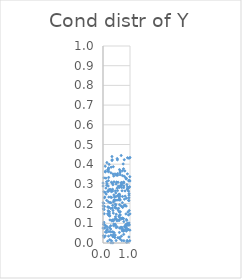
| Category | Series 0 |
|---|---|
| -100.0 | -100 |
| -100.0 | -100 |
| 0.3770401600886948 | 0.055 |
| -100.0 | -100 |
| -100.0 | -100 |
| -100.0 | -100 |
| -100.0 | -100 |
| -100.0 | -100 |
| -100.0 | -100 |
| -100.0 | -100 |
| -100.0 | -100 |
| -100.0 | -100 |
| -100.0 | -100 |
| -100.0 | -100 |
| -100.0 | -100 |
| -100.0 | -100 |
| -100.0 | -100 |
| -100.0 | -100 |
| 0.6913945157025785 | 0.291 |
| -100.0 | -100 |
| -100.0 | -100 |
| -100.0 | -100 |
| -100.0 | -100 |
| -100.0 | -100 |
| -100.0 | -100 |
| -100.0 | -100 |
| -100.0 | -100 |
| -100.0 | -100 |
| -100.0 | -100 |
| 0.33213109948831887 | 0.439 |
| -100.0 | -100 |
| -100.0 | -100 |
| -100.0 | -100 |
| -100.0 | -100 |
| -100.0 | -100 |
| -100.0 | -100 |
| -100.0 | -100 |
| -100.0 | -100 |
| -100.0 | -100 |
| -100.0 | -100 |
| -100.0 | -100 |
| -100.0 | -100 |
| -100.0 | -100 |
| -100.0 | -100 |
| -100.0 | -100 |
| -100.0 | -100 |
| -100.0 | -100 |
| -100.0 | -100 |
| -100.0 | -100 |
| -100.0 | -100 |
| -100.0 | -100 |
| -100.0 | -100 |
| -100.0 | -100 |
| -100.0 | -100 |
| -100.0 | -100 |
| -100.0 | -100 |
| -100.0 | -100 |
| 0.8707011105194766 | 0.092 |
| -100.0 | -100 |
| 0.6123782956940411 | 0.247 |
| -100.0 | -100 |
| -100.0 | -100 |
| -100.0 | -100 |
| 0.7055638715201182 | 0.265 |
| -100.0 | -100 |
| 0.19282466787788288 | 0.164 |
| -100.0 | -100 |
| -100.0 | -100 |
| -100.0 | -100 |
| -100.0 | -100 |
| -100.0 | -100 |
| -100.0 | -100 |
| -100.0 | -100 |
| -100.0 | -100 |
| -100.0 | -100 |
| -100.0 | -100 |
| -100.0 | -100 |
| -100.0 | -100 |
| -100.0 | -100 |
| -100.0 | -100 |
| -100.0 | -100 |
| -100.0 | -100 |
| -100.0 | -100 |
| 0.7735663524071709 | 0.012 |
| -100.0 | -100 |
| -100.0 | -100 |
| -100.0 | -100 |
| -100.0 | -100 |
| -100.0 | -100 |
| 0.7619688938425507 | 0.06 |
| -100.0 | -100 |
| -100.0 | -100 |
| -100.0 | -100 |
| 0.5857647660866955 | 0.136 |
| -100.0 | -100 |
| -100.0 | -100 |
| -100.0 | -100 |
| -100.0 | -100 |
| -100.0 | -100 |
| 0.7190541993906285 | 0.366 |
| -100.0 | -100 |
| -100.0 | -100 |
| -100.0 | -100 |
| -100.0 | -100 |
| -100.0 | -100 |
| -100.0 | -100 |
| -100.0 | -100 |
| -100.0 | -100 |
| -100.0 | -100 |
| -100.0 | -100 |
| -100.0 | -100 |
| -100.0 | -100 |
| 0.25015358290772716 | 0.017 |
| -100.0 | -100 |
| 0.24862008410082637 | 0.137 |
| -100.0 | -100 |
| -100.0 | -100 |
| -100.0 | -100 |
| -100.0 | -100 |
| -100.0 | -100 |
| 0.35625961474772116 | 0.273 |
| 0.24089883907188347 | 0.079 |
| -100.0 | -100 |
| -100.0 | -100 |
| -100.0 | -100 |
| -100.0 | -100 |
| 0.3563894415014067 | 0.264 |
| -100.0 | -100 |
| -100.0 | -100 |
| -100.0 | -100 |
| -100.0 | -100 |
| 0.8096488342345498 | 0.366 |
| -100.0 | -100 |
| -100.0 | -100 |
| -100.0 | -100 |
| -100.0 | -100 |
| -100.0 | -100 |
| 0.7379044353510774 | 0.124 |
| -100.0 | -100 |
| -100.0 | -100 |
| -100.0 | -100 |
| -100.0 | -100 |
| -100.0 | -100 |
| -100.0 | -100 |
| -100.0 | -100 |
| 0.17247290289690154 | 0.009 |
| -100.0 | -100 |
| 0.315393455620698 | 0.231 |
| -100.0 | -100 |
| -100.0 | -100 |
| 0.4853713603107648 | 0.299 |
| -100.0 | -100 |
| -100.0 | -100 |
| 0.286843181365671 | 0.088 |
| -100.0 | -100 |
| -100.0 | -100 |
| -100.0 | -100 |
| -100.0 | -100 |
| -100.0 | -100 |
| -100.0 | -100 |
| -100.0 | -100 |
| 0.99370991064668 | 0.337 |
| -100.0 | -100 |
| -100.0 | -100 |
| -100.0 | -100 |
| -100.0 | -100 |
| -100.0 | -100 |
| -100.0 | -100 |
| -100.0 | -100 |
| -100.0 | -100 |
| -100.0 | -100 |
| -100.0 | -100 |
| -100.0 | -100 |
| -100.0 | -100 |
| -100.0 | -100 |
| 0.3707663434086337 | 0.35 |
| -100.0 | -100 |
| -100.0 | -100 |
| -100.0 | -100 |
| -100.0 | -100 |
| -100.0 | -100 |
| -100.0 | -100 |
| -100.0 | -100 |
| -100.0 | -100 |
| -100.0 | -100 |
| -100.0 | -100 |
| -100.0 | -100 |
| 0.20483892071107856 | 0.376 |
| -100.0 | -100 |
| -100.0 | -100 |
| -100.0 | -100 |
| -100.0 | -100 |
| -100.0 | -100 |
| -100.0 | -100 |
| -100.0 | -100 |
| -100.0 | -100 |
| -100.0 | -100 |
| -100.0 | -100 |
| -100.0 | -100 |
| -100.0 | -100 |
| -100.0 | -100 |
| 0.6411752869463068 | 0.159 |
| -100.0 | -100 |
| -100.0 | -100 |
| -100.0 | -100 |
| 0.0047189266787509565 | 0.204 |
| -100.0 | -100 |
| -100.0 | -100 |
| -100.0 | -100 |
| -100.0 | -100 |
| -100.0 | -100 |
| -100.0 | -100 |
| -100.0 | -100 |
| -100.0 | -100 |
| -100.0 | -100 |
| -100.0 | -100 |
| 0.5598886900185825 | 0.308 |
| -100.0 | -100 |
| -100.0 | -100 |
| -100.0 | -100 |
| -100.0 | -100 |
| -100.0 | -100 |
| -100.0 | -100 |
| -100.0 | -100 |
| 0.26218682187245124 | 0.205 |
| -100.0 | -100 |
| -100.0 | -100 |
| -100.0 | -100 |
| -100.0 | -100 |
| 0.6357231042318005 | 0.02 |
| -100.0 | -100 |
| -100.0 | -100 |
| -100.0 | -100 |
| -100.0 | -100 |
| -100.0 | -100 |
| -100.0 | -100 |
| -100.0 | -100 |
| -100.0 | -100 |
| 0.17058249460375985 | 0.262 |
| -100.0 | -100 |
| 0.721867158614324 | 0.182 |
| -100.0 | -100 |
| -100.0 | -100 |
| -100.0 | -100 |
| 0.9036179115283761 | 0.07 |
| -100.0 | -100 |
| -100.0 | -100 |
| -100.0 | -100 |
| -100.0 | -100 |
| -100.0 | -100 |
| -100.0 | -100 |
| -100.0 | -100 |
| 0.9891860247645243 | 0.012 |
| -100.0 | -100 |
| -100.0 | -100 |
| 0.34929064394747134 | 0.178 |
| -100.0 | -100 |
| -100.0 | -100 |
| -100.0 | -100 |
| -100.0 | -100 |
| -100.0 | -100 |
| 0.9101196203561309 | 0.271 |
| 0.6618343937263028 | 0.293 |
| -100.0 | -100 |
| -100.0 | -100 |
| -100.0 | -100 |
| -100.0 | -100 |
| 0.5925541100929643 | 0.248 |
| -100.0 | -100 |
| -100.0 | -100 |
| 0.37776906504216756 | 0.117 |
| -100.0 | -100 |
| -100.0 | -100 |
| -100.0 | -100 |
| -100.0 | -100 |
| -100.0 | -100 |
| -100.0 | -100 |
| -100.0 | -100 |
| -100.0 | -100 |
| -100.0 | -100 |
| -100.0 | -100 |
| -100.0 | -100 |
| 0.016936103314077466 | 0.037 |
| -100.0 | -100 |
| -100.0 | -100 |
| -100.0 | -100 |
| -100.0 | -100 |
| -100.0 | -100 |
| -100.0 | -100 |
| -100.0 | -100 |
| -100.0 | -100 |
| -100.0 | -100 |
| -100.0 | -100 |
| -100.0 | -100 |
| -100.0 | -100 |
| -100.0 | -100 |
| -100.0 | -100 |
| -100.0 | -100 |
| -100.0 | -100 |
| -100.0 | -100 |
| -100.0 | -100 |
| -100.0 | -100 |
| -100.0 | -100 |
| -100.0 | -100 |
| -100.0 | -100 |
| -100.0 | -100 |
| -100.0 | -100 |
| -100.0 | -100 |
| -100.0 | -100 |
| -100.0 | -100 |
| -100.0 | -100 |
| 0.2127999804069317 | 0.27 |
| -100.0 | -100 |
| -100.0 | -100 |
| -100.0 | -100 |
| -100.0 | -100 |
| -100.0 | -100 |
| -100.0 | -100 |
| -100.0 | -100 |
| -100.0 | -100 |
| -100.0 | -100 |
| -100.0 | -100 |
| -100.0 | -100 |
| -100.0 | -100 |
| -100.0 | -100 |
| -100.0 | -100 |
| -100.0 | -100 |
| -100.0 | -100 |
| 0.23855718428013994 | 0.158 |
| -100.0 | -100 |
| -100.0 | -100 |
| -100.0 | -100 |
| 0.05178797495180687 | 0.23 |
| -100.0 | -100 |
| -100.0 | -100 |
| -100.0 | -100 |
| -100.0 | -100 |
| -100.0 | -100 |
| -100.0 | -100 |
| -100.0 | -100 |
| -100.0 | -100 |
| -100.0 | -100 |
| -100.0 | -100 |
| -100.0 | -100 |
| 0.8206559675460036 | 0.189 |
| 0.6139132337469843 | 0.076 |
| -100.0 | -100 |
| -100.0 | -100 |
| -100.0 | -100 |
| -100.0 | -100 |
| -100.0 | -100 |
| -100.0 | -100 |
| -100.0 | -100 |
| 0.4027023508829586 | 0.244 |
| -100.0 | -100 |
| -100.0 | -100 |
| -100.0 | -100 |
| -100.0 | -100 |
| -100.0 | -100 |
| -100.0 | -100 |
| -100.0 | -100 |
| -100.0 | -100 |
| -100.0 | -100 |
| -100.0 | -100 |
| -100.0 | -100 |
| -100.0 | -100 |
| -100.0 | -100 |
| -100.0 | -100 |
| 0.29177457604554813 | 0.356 |
| -100.0 | -100 |
| -100.0 | -100 |
| -100.0 | -100 |
| -100.0 | -100 |
| -100.0 | -100 |
| 0.9208222156654879 | 0.157 |
| -100.0 | -100 |
| -100.0 | -100 |
| -100.0 | -100 |
| 0.0665322853281024 | 0.077 |
| -100.0 | -100 |
| -100.0 | -100 |
| -100.0 | -100 |
| -100.0 | -100 |
| -100.0 | -100 |
| -100.0 | -100 |
| -100.0 | -100 |
| 0.06780708630164067 | 0.233 |
| -100.0 | -100 |
| -100.0 | -100 |
| -100.0 | -100 |
| -100.0 | -100 |
| -100.0 | -100 |
| -100.0 | -100 |
| -100.0 | -100 |
| -100.0 | -100 |
| -100.0 | -100 |
| -100.0 | -100 |
| -100.0 | -100 |
| -100.0 | -100 |
| -100.0 | -100 |
| -100.0 | -100 |
| -100.0 | -100 |
| 0.8826537246963788 | 0.115 |
| -100.0 | -100 |
| -100.0 | -100 |
| -100.0 | -100 |
| -100.0 | -100 |
| -100.0 | -100 |
| 0.7351152672140836 | 0.069 |
| -100.0 | -100 |
| -100.0 | -100 |
| -100.0 | -100 |
| -100.0 | -100 |
| -100.0 | -100 |
| -100.0 | -100 |
| -100.0 | -100 |
| -100.0 | -100 |
| -100.0 | -100 |
| -100.0 | -100 |
| -100.0 | -100 |
| -100.0 | -100 |
| -100.0 | -100 |
| -100.0 | -100 |
| -100.0 | -100 |
| -100.0 | -100 |
| -100.0 | -100 |
| -100.0 | -100 |
| -100.0 | -100 |
| -100.0 | -100 |
| -100.0 | -100 |
| -100.0 | -100 |
| -100.0 | -100 |
| -100.0 | -100 |
| -100.0 | -100 |
| -100.0 | -100 |
| -100.0 | -100 |
| -100.0 | -100 |
| -100.0 | -100 |
| -100.0 | -100 |
| -100.0 | -100 |
| 0.42411828775346494 | 0.234 |
| -100.0 | -100 |
| -100.0 | -100 |
| -100.0 | -100 |
| -100.0 | -100 |
| -100.0 | -100 |
| 0.48604171091406234 | 0.013 |
| -100.0 | -100 |
| -100.0 | -100 |
| -100.0 | -100 |
| -100.0 | -100 |
| -100.0 | -100 |
| -100.0 | -100 |
| -100.0 | -100 |
| -100.0 | -100 |
| 0.3473043457619077 | 0.117 |
| -100.0 | -100 |
| -100.0 | -100 |
| -100.0 | -100 |
| 0.20387021220571977 | 0.262 |
| -100.0 | -100 |
| -100.0 | -100 |
| -100.0 | -100 |
| -100.0 | -100 |
| -100.0 | -100 |
| -100.0 | -100 |
| -100.0 | -100 |
| 0.17213446560471746 | 0.148 |
| -100.0 | -100 |
| 0.1445523625841938 | 0.408 |
| -100.0 | -100 |
| -100.0 | -100 |
| -100.0 | -100 |
| -100.0 | -100 |
| -100.0 | -100 |
| -100.0 | -100 |
| -100.0 | -100 |
| -100.0 | -100 |
| -100.0 | -100 |
| -100.0 | -100 |
| -100.0 | -100 |
| -100.0 | -100 |
| 0.28478546794542814 | 0.057 |
| -100.0 | -100 |
| -100.0 | -100 |
| -100.0 | -100 |
| -100.0 | -100 |
| 0.5493685764881231 | 0.027 |
| -100.0 | -100 |
| -100.0 | -100 |
| -100.0 | -100 |
| 0.9590602246147503 | 0.031 |
| -100.0 | -100 |
| -100.0 | -100 |
| 0.8335299418979698 | 0.081 |
| -100.0 | -100 |
| -100.0 | -100 |
| -100.0 | -100 |
| -100.0 | -100 |
| -100.0 | -100 |
| -100.0 | -100 |
| -100.0 | -100 |
| -100.0 | -100 |
| -100.0 | -100 |
| 0.6362313894038706 | 0.365 |
| -100.0 | -100 |
| -100.0 | -100 |
| -100.0 | -100 |
| -100.0 | -100 |
| -100.0 | -100 |
| -100.0 | -100 |
| -100.0 | -100 |
| -100.0 | -100 |
| -100.0 | -100 |
| -100.0 | -100 |
| -100.0 | -100 |
| -100.0 | -100 |
| -100.0 | -100 |
| 0.5780401185811183 | 0.176 |
| -100.0 | -100 |
| -100.0 | -100 |
| -100.0 | -100 |
| 0.3830650336019338 | 0.041 |
| -100.0 | -100 |
| -100.0 | -100 |
| -100.0 | -100 |
| -100.0 | -100 |
| -100.0 | -100 |
| -100.0 | -100 |
| -100.0 | -100 |
| -100.0 | -100 |
| -100.0 | -100 |
| -100.0 | -100 |
| 0.48475160308143517 | 0.176 |
| -100.0 | -100 |
| -100.0 | -100 |
| 0.3242281908438168 | 0.112 |
| -100.0 | -100 |
| -100.0 | -100 |
| -100.0 | -100 |
| -100.0 | -100 |
| -100.0 | -100 |
| -100.0 | -100 |
| -100.0 | -100 |
| -100.0 | -100 |
| -100.0 | -100 |
| -100.0 | -100 |
| 0.5838517933186005 | 0.22 |
| -100.0 | -100 |
| -100.0 | -100 |
| -100.0 | -100 |
| -100.0 | -100 |
| -100.0 | -100 |
| -100.0 | -100 |
| -100.0 | -100 |
| -100.0 | -100 |
| -100.0 | -100 |
| -100.0 | -100 |
| 0.9042350745434901 | 0.351 |
| -100.0 | -100 |
| -100.0 | -100 |
| -100.0 | -100 |
| -100.0 | -100 |
| -100.0 | -100 |
| -100.0 | -100 |
| -100.0 | -100 |
| -100.0 | -100 |
| -100.0 | -100 |
| -100.0 | -100 |
| -100.0 | -100 |
| -100.0 | -100 |
| -100.0 | -100 |
| -100.0 | -100 |
| 0.1999533531535448 | 0.316 |
| -100.0 | -100 |
| 0.6686756165890543 | 0.124 |
| -100.0 | -100 |
| -100.0 | -100 |
| -100.0 | -100 |
| -100.0 | -100 |
| -100.0 | -100 |
| -100.0 | -100 |
| -100.0 | -100 |
| -100.0 | -100 |
| -100.0 | -100 |
| -100.0 | -100 |
| 0.19835692425443519 | 0.366 |
| 0.1631372747308767 | 0.07 |
| -100.0 | -100 |
| -100.0 | -100 |
| -100.0 | -100 |
| -100.0 | -100 |
| -100.0 | -100 |
| -100.0 | -100 |
| -100.0 | -100 |
| -100.0 | -100 |
| -100.0 | -100 |
| -100.0 | -100 |
| -100.0 | -100 |
| -100.0 | -100 |
| -100.0 | -100 |
| -100.0 | -100 |
| -100.0 | -100 |
| -100.0 | -100 |
| -100.0 | -100 |
| -100.0 | -100 |
| -100.0 | -100 |
| -100.0 | -100 |
| -100.0 | -100 |
| -100.0 | -100 |
| -100.0 | -100 |
| -100.0 | -100 |
| -100.0 | -100 |
| -100.0 | -100 |
| -100.0 | -100 |
| -100.0 | -100 |
| -100.0 | -100 |
| -100.0 | -100 |
| -100.0 | -100 |
| -100.0 | -100 |
| -100.0 | -100 |
| -100.0 | -100 |
| -100.0 | -100 |
| 0.8956222989444316 | 0.013 |
| -100.0 | -100 |
| 0.20584356953565142 | 0.381 |
| -100.0 | -100 |
| -100.0 | -100 |
| -100.0 | -100 |
| -100.0 | -100 |
| -100.0 | -100 |
| -100.0 | -100 |
| -100.0 | -100 |
| 0.577068559446596 | 0.236 |
| -100.0 | -100 |
| -100.0 | -100 |
| -100.0 | -100 |
| -100.0 | -100 |
| -100.0 | -100 |
| -100.0 | -100 |
| 0.388822918600785 | 0.208 |
| -100.0 | -100 |
| -100.0 | -100 |
| -100.0 | -100 |
| -100.0 | -100 |
| -100.0 | -100 |
| 0.07777021280039365 | 0.257 |
| -100.0 | -100 |
| -100.0 | -100 |
| -100.0 | -100 |
| -100.0 | -100 |
| -100.0 | -100 |
| 0.5919151004512939 | 0.284 |
| -100.0 | -100 |
| -100.0 | -100 |
| -100.0 | -100 |
| 0.17696826387912135 | 0.372 |
| -100.0 | -100 |
| 0.9850324376653254 | 0.285 |
| -100.0 | -100 |
| -100.0 | -100 |
| -100.0 | -100 |
| -100.0 | -100 |
| -100.0 | -100 |
| -100.0 | -100 |
| -100.0 | -100 |
| -100.0 | -100 |
| -100.0 | -100 |
| -100.0 | -100 |
| -100.0 | -100 |
| -100.0 | -100 |
| -100.0 | -100 |
| -100.0 | -100 |
| -100.0 | -100 |
| -100.0 | -100 |
| -100.0 | -100 |
| -100.0 | -100 |
| -100.0 | -100 |
| 0.5420806201659478 | 0.344 |
| -100.0 | -100 |
| -100.0 | -100 |
| 0.6921422658287867 | 0.123 |
| -100.0 | -100 |
| -100.0 | -100 |
| -100.0 | -100 |
| 0.552553589100597 | 0.174 |
| -100.0 | -100 |
| -100.0 | -100 |
| -100.0 | -100 |
| -100.0 | -100 |
| 0.8488629937304234 | 0.147 |
| -100.0 | -100 |
| -100.0 | -100 |
| 0.9077538267467223 | 0.433 |
| -100.0 | -100 |
| -100.0 | -100 |
| -100.0 | -100 |
| -100.0 | -100 |
| -100.0 | -100 |
| -100.0 | -100 |
| 0.6340829413864436 | 0.347 |
| -100.0 | -100 |
| -100.0 | -100 |
| -100.0 | -100 |
| -100.0 | -100 |
| -100.0 | -100 |
| -100.0 | -100 |
| -100.0 | -100 |
| -100.0 | -100 |
| -100.0 | -100 |
| -100.0 | -100 |
| -100.0 | -100 |
| -100.0 | -100 |
| -100.0 | -100 |
| -100.0 | -100 |
| -100.0 | -100 |
| -100.0 | -100 |
| -100.0 | -100 |
| -100.0 | -100 |
| 0.45881403158455014 | 0.264 |
| -100.0 | -100 |
| -100.0 | -100 |
| 0.9756271854557683 | 0.092 |
| -100.0 | -100 |
| -100.0 | -100 |
| -100.0 | -100 |
| -100.0 | -100 |
| -100.0 | -100 |
| -100.0 | -100 |
| 0.31359900893341974 | 0.012 |
| -100.0 | -100 |
| -100.0 | -100 |
| 0.768006095408884 | 0.31 |
| 0.8677883006619158 | 0.328 |
| 0.6152467249742798 | 0.194 |
| -100.0 | -100 |
| -100.0 | -100 |
| -100.0 | -100 |
| -100.0 | -100 |
| -100.0 | -100 |
| -100.0 | -100 |
| 0.8959984174927841 | 0.274 |
| -100.0 | -100 |
| -100.0 | -100 |
| -100.0 | -100 |
| -100.0 | -100 |
| -100.0 | -100 |
| -100.0 | -100 |
| -100.0 | -100 |
| -100.0 | -100 |
| 0.8392663974706244 | 0.331 |
| -100.0 | -100 |
| -100.0 | -100 |
| -100.0 | -100 |
| -100.0 | -100 |
| -100.0 | -100 |
| -100.0 | -100 |
| -100.0 | -100 |
| -100.0 | -100 |
| -100.0 | -100 |
| -100.0 | -100 |
| -100.0 | -100 |
| -100.0 | -100 |
| -100.0 | -100 |
| -100.0 | -100 |
| 0.45524642133074955 | 0.123 |
| -100.0 | -100 |
| -100.0 | -100 |
| -100.0 | -100 |
| 0.6010487845452768 | 0.116 |
| 0.8599806182494371 | 0.187 |
| -100.0 | -100 |
| -100.0 | -100 |
| -100.0 | -100 |
| -100.0 | -100 |
| -100.0 | -100 |
| -100.0 | -100 |
| -100.0 | -100 |
| -100.0 | -100 |
| -100.0 | -100 |
| -100.0 | -100 |
| 0.3755476556356424 | 0.112 |
| -100.0 | -100 |
| -100.0 | -100 |
| -100.0 | -100 |
| -100.0 | -100 |
| -100.0 | -100 |
| -100.0 | -100 |
| -100.0 | -100 |
| 0.00455978771621135 | 0.188 |
| -100.0 | -100 |
| -100.0 | -100 |
| -100.0 | -100 |
| -100.0 | -100 |
| -100.0 | -100 |
| -100.0 | -100 |
| -100.0 | -100 |
| -100.0 | -100 |
| -100.0 | -100 |
| -100.0 | -100 |
| -100.0 | -100 |
| -100.0 | -100 |
| 0.03151058658474193 | 0.26 |
| -100.0 | -100 |
| -100.0 | -100 |
| -100.0 | -100 |
| -100.0 | -100 |
| -100.0 | -100 |
| -100.0 | -100 |
| -100.0 | -100 |
| -100.0 | -100 |
| -100.0 | -100 |
| -100.0 | -100 |
| -100.0 | -100 |
| -100.0 | -100 |
| -100.0 | -100 |
| -100.0 | -100 |
| -100.0 | -100 |
| -100.0 | -100 |
| -100.0 | -100 |
| -100.0 | -100 |
| -100.0 | -100 |
| -100.0 | -100 |
| -100.0 | -100 |
| -100.0 | -100 |
| -100.0 | -100 |
| -100.0 | -100 |
| -100.0 | -100 |
| -100.0 | -100 |
| -100.0 | -100 |
| -100.0 | -100 |
| -100.0 | -100 |
| -100.0 | -100 |
| -100.0 | -100 |
| -100.0 | -100 |
| -100.0 | -100 |
| -100.0 | -100 |
| -100.0 | -100 |
| -100.0 | -100 |
| -100.0 | -100 |
| -100.0 | -100 |
| -100.0 | -100 |
| -100.0 | -100 |
| -100.0 | -100 |
| -100.0 | -100 |
| -100.0 | -100 |
| -100.0 | -100 |
| -100.0 | -100 |
| -100.0 | -100 |
| -100.0 | -100 |
| -100.0 | -100 |
| 0.6927581288692315 | 0.299 |
| -100.0 | -100 |
| -100.0 | -100 |
| -100.0 | -100 |
| -100.0 | -100 |
| -100.0 | -100 |
| -100.0 | -100 |
| -100.0 | -100 |
| -100.0 | -100 |
| -100.0 | -100 |
| -100.0 | -100 |
| -100.0 | -100 |
| 0.09142290454788005 | 0.089 |
| 0.9645503005092667 | 0.25 |
| 0.7858349572824984 | 0.191 |
| 0.22086267923440472 | 0.18 |
| -100.0 | -100 |
| -100.0 | -100 |
| -100.0 | -100 |
| -100.0 | -100 |
| -100.0 | -100 |
| 0.51459410416059 | 0.118 |
| -100.0 | -100 |
| -100.0 | -100 |
| -100.0 | -100 |
| -100.0 | -100 |
| 0.197177732035701 | 0.183 |
| -100.0 | -100 |
| -100.0 | -100 |
| -100.0 | -100 |
| -100.0 | -100 |
| -100.0 | -100 |
| -100.0 | -100 |
| 0.2968764456622638 | 0.001 |
| -100.0 | -100 |
| -100.0 | -100 |
| -100.0 | -100 |
| -100.0 | -100 |
| -100.0 | -100 |
| -100.0 | -100 |
| -100.0 | -100 |
| -100.0 | -100 |
| -100.0 | -100 |
| -100.0 | -100 |
| -100.0 | -100 |
| -100.0 | -100 |
| 0.43064883158171463 | 0.029 |
| -100.0 | -100 |
| -100.0 | -100 |
| -100.0 | -100 |
| -100.0 | -100 |
| -100.0 | -100 |
| 0.17404739352441734 | 0.183 |
| -100.0 | -100 |
| -100.0 | -100 |
| -100.0 | -100 |
| -100.0 | -100 |
| -100.0 | -100 |
| -100.0 | -100 |
| -100.0 | -100 |
| -100.0 | -100 |
| -100.0 | -100 |
| -100.0 | -100 |
| 0.96256508138763 | 0.102 |
| -100.0 | -100 |
| -100.0 | -100 |
| -100.0 | -100 |
| -100.0 | -100 |
| -100.0 | -100 |
| -100.0 | -100 |
| -100.0 | -100 |
| -100.0 | -100 |
| -100.0 | -100 |
| -100.0 | -100 |
| -100.0 | -100 |
| -100.0 | -100 |
| -100.0 | -100 |
| -100.0 | -100 |
| -100.0 | -100 |
| -100.0 | -100 |
| -100.0 | -100 |
| -100.0 | -100 |
| -100.0 | -100 |
| -100.0 | -100 |
| -100.0 | -100 |
| 0.339841974460237 | 0.422 |
| -100.0 | -100 |
| -100.0 | -100 |
| -100.0 | -100 |
| -100.0 | -100 |
| -100.0 | -100 |
| -100.0 | -100 |
| -100.0 | -100 |
| -100.0 | -100 |
| -100.0 | -100 |
| -100.0 | -100 |
| -100.0 | -100 |
| -100.0 | -100 |
| -100.0 | -100 |
| -100.0 | -100 |
| -100.0 | -100 |
| -100.0 | -100 |
| -100.0 | -100 |
| -100.0 | -100 |
| -100.0 | -100 |
| -100.0 | -100 |
| -100.0 | -100 |
| -100.0 | -100 |
| -100.0 | -100 |
| -100.0 | -100 |
| -100.0 | -100 |
| -100.0 | -100 |
| 0.0004465700328029065 | 0.304 |
| -100.0 | -100 |
| -100.0 | -100 |
| -100.0 | -100 |
| -100.0 | -100 |
| -100.0 | -100 |
| -100.0 | -100 |
| -100.0 | -100 |
| -100.0 | -100 |
| -100.0 | -100 |
| -100.0 | -100 |
| -100.0 | -100 |
| -100.0 | -100 |
| -100.0 | -100 |
| -100.0 | -100 |
| -100.0 | -100 |
| -100.0 | -100 |
| -100.0 | -100 |
| -100.0 | -100 |
| -100.0 | -100 |
| -100.0 | -100 |
| -100.0 | -100 |
| -100.0 | -100 |
| -100.0 | -100 |
| -100.0 | -100 |
| -100.0 | -100 |
| -100.0 | -100 |
| 0.20979730202030633 | 0.333 |
| -100.0 | -100 |
| -100.0 | -100 |
| -100.0 | -100 |
| -100.0 | -100 |
| -100.0 | -100 |
| 0.4896147592398563 | 0.344 |
| -100.0 | -100 |
| -100.0 | -100 |
| -100.0 | -100 |
| -100.0 | -100 |
| -100.0 | -100 |
| -100.0 | -100 |
| -100.0 | -100 |
| -100.0 | -100 |
| -100.0 | -100 |
| -100.0 | -100 |
| 0.5681066527665231 | 0.165 |
| -100.0 | -100 |
| -100.0 | -100 |
| -100.0 | -100 |
| -100.0 | -100 |
| -100.0 | -100 |
| -100.0 | -100 |
| -100.0 | -100 |
| -100.0 | -100 |
| -100.0 | -100 |
| -100.0 | -100 |
| -100.0 | -100 |
| 0.44268885373194455 | 0.184 |
| 0.01984809089938322 | 0.095 |
| 0.45357586060157207 | 0.04 |
| -100.0 | -100 |
| -100.0 | -100 |
| -100.0 | -100 |
| -100.0 | -100 |
| -100.0 | -100 |
| -100.0 | -100 |
| -100.0 | -100 |
| -100.0 | -100 |
| 0.5127503489402726 | 0.308 |
| -100.0 | -100 |
| -100.0 | -100 |
| -100.0 | -100 |
| -100.0 | -100 |
| -100.0 | -100 |
| -100.0 | -100 |
| -100.0 | -100 |
| 0.7735496449176846 | 0.29 |
| -100.0 | -100 |
| -100.0 | -100 |
| -100.0 | -100 |
| -100.0 | -100 |
| -100.0 | -100 |
| -100.0 | -100 |
| -100.0 | -100 |
| -100.0 | -100 |
| -100.0 | -100 |
| -100.0 | -100 |
| -100.0 | -100 |
| -100.0 | -100 |
| -100.0 | -100 |
| 0.6121772327041202 | 0.14 |
| -100.0 | -100 |
| 0.43654888059258323 | 0.028 |
| -100.0 | -100 |
| -100.0 | -100 |
| -100.0 | -100 |
| -100.0 | -100 |
| -100.0 | -100 |
| -100.0 | -100 |
| -100.0 | -100 |
| -100.0 | -100 |
| -100.0 | -100 |
| -100.0 | -100 |
| 0.4806000786111889 | 0.194 |
| -100.0 | -100 |
| -100.0 | -100 |
| -100.0 | -100 |
| -100.0 | -100 |
| -100.0 | -100 |
| -100.0 | -100 |
| -100.0 | -100 |
| -100.0 | -100 |
| -100.0 | -100 |
| -100.0 | -100 |
| -100.0 | -100 |
| -100.0 | -100 |
| -100.0 | -100 |
| -100.0 | -100 |
| -100.0 | -100 |
| 0.9727994890727825 | 0.318 |
| -100.0 | -100 |
| -100.0 | -100 |
| -100.0 | -100 |
| -100.0 | -100 |
| -100.0 | -100 |
| 0.9157075769121742 | 0.005 |
| -100.0 | -100 |
| -100.0 | -100 |
| -100.0 | -100 |
| -100.0 | -100 |
| -100.0 | -100 |
| -100.0 | -100 |
| -100.0 | -100 |
| -100.0 | -100 |
| -100.0 | -100 |
| -100.0 | -100 |
| -100.0 | -100 |
| 0.3934247255628939 | 0.088 |
| -100.0 | -100 |
| -100.0 | -100 |
| -100.0 | -100 |
| -100.0 | -100 |
| -100.0 | -100 |
| -100.0 | -100 |
| -100.0 | -100 |
| -100.0 | -100 |
| -100.0 | -100 |
| -100.0 | -100 |
| -100.0 | -100 |
| -100.0 | -100 |
| -100.0 | -100 |
| -100.0 | -100 |
| -100.0 | -100 |
| -100.0 | -100 |
| 0.4586998835743056 | 0.197 |
| -100.0 | -100 |
| -100.0 | -100 |
| 0.033208634921095936 | 0.331 |
| -100.0 | -100 |
| -100.0 | -100 |
| -100.0 | -100 |
| -100.0 | -100 |
| -100.0 | -100 |
| -100.0 | -100 |
| -100.0 | -100 |
| -100.0 | -100 |
| 0.11860535695333208 | 0.248 |
| -100.0 | -100 |
| 0.6035178476581329 | 0.282 |
| -100.0 | -100 |
| -100.0 | -100 |
| -100.0 | -100 |
| -100.0 | -100 |
| -100.0 | -100 |
| -100.0 | -100 |
| 0.6071110858480017 | 0.054 |
| -100.0 | -100 |
| -100.0 | -100 |
| -100.0 | -100 |
| -100.0 | -100 |
| 0.1325320798479631 | 0.311 |
| -100.0 | -100 |
| -100.0 | -100 |
| -100.0 | -100 |
| -100.0 | -100 |
| -100.0 | -100 |
| -100.0 | -100 |
| -100.0 | -100 |
| -100.0 | -100 |
| -100.0 | -100 |
| -100.0 | -100 |
| -100.0 | -100 |
| 0.22269695885558993 | 0.058 |
| -100.0 | -100 |
| -100.0 | -100 |
| -100.0 | -100 |
| -100.0 | -100 |
| -100.0 | -100 |
| -100.0 | -100 |
| -100.0 | -100 |
| -100.0 | -100 |
| -100.0 | -100 |
| -100.0 | -100 |
| -100.0 | -100 |
| 0.44476595598663804 | 0.351 |
| -100.0 | -100 |
| -100.0 | -100 |
| -100.0 | -100 |
| -100.0 | -100 |
| -100.0 | -100 |
| -100.0 | -100 |
| -100.0 | -100 |
| -100.0 | -100 |
| -100.0 | -100 |
| 0.3110775362938648 | 0.261 |
| -100.0 | -100 |
| -100.0 | -100 |
| -100.0 | -100 |
| -100.0 | -100 |
| -100.0 | -100 |
| 0.29647942918023373 | 0.04 |
| -100.0 | -100 |
| -100.0 | -100 |
| -100.0 | -100 |
| -100.0 | -100 |
| -100.0 | -100 |
| -100.0 | -100 |
| -100.0 | -100 |
| -100.0 | -100 |
| -100.0 | -100 |
| -100.0 | -100 |
| -100.0 | -100 |
| -100.0 | -100 |
| -100.0 | -100 |
| -100.0 | -100 |
| -100.0 | -100 |
| -100.0 | -100 |
| 0.04121439483243228 | 0.029 |
| -100.0 | -100 |
| 0.8011951817732197 | 0.082 |
| -100.0 | -100 |
| -100.0 | -100 |
| -100.0 | -100 |
| -100.0 | -100 |
| -100.0 | -100 |
| -100.0 | -100 |
| -100.0 | -100 |
| -100.0 | -100 |
| -100.0 | -100 |
| -100.0 | -100 |
| -100.0 | -100 |
| -100.0 | -100 |
| -100.0 | -100 |
| -100.0 | -100 |
| -100.0 | -100 |
| -100.0 | -100 |
| -100.0 | -100 |
| -100.0 | -100 |
| -100.0 | -100 |
| -100.0 | -100 |
| -100.0 | -100 |
| -100.0 | -100 |
| -100.0 | -100 |
| -100.0 | -100 |
| 0.46551630905785313 | 0.217 |
| -100.0 | -100 |
| -100.0 | -100 |
| -100.0 | -100 |
| -100.0 | -100 |
| -100.0 | -100 |
| -100.0 | -100 |
| -100.0 | -100 |
| 0.5392615772719487 | 0.24 |
| -100.0 | -100 |
| -100.0 | -100 |
| -100.0 | -100 |
| -100.0 | -100 |
| -100.0 | -100 |
| -100.0 | -100 |
| -100.0 | -100 |
| -100.0 | -100 |
| -100.0 | -100 |
| -100.0 | -100 |
| -100.0 | -100 |
| -100.0 | -100 |
| 0.0445028603438391 | 0.148 |
| -100.0 | -100 |
| -100.0 | -100 |
| -100.0 | -100 |
| -100.0 | -100 |
| -100.0 | -100 |
| -100.0 | -100 |
| -100.0 | -100 |
| -100.0 | -100 |
| -100.0 | -100 |
| -100.0 | -100 |
| -100.0 | -100 |
| 0.607609178526056 | 0.228 |
| 0.3582830783888259 | 0.191 |
| -100.0 | -100 |
| -100.0 | -100 |
| -100.0 | -100 |
| -100.0 | -100 |
| -100.0 | -100 |
| -100.0 | -100 |
| 0.998213293910305 | 0.148 |
| 0.3336587039977059 | 0.419 |
| -100.0 | -100 |
| -100.0 | -100 |
| -100.0 | -100 |
| -100.0 | -100 |
| -100.0 | -100 |
| -100.0 | -100 |
| -100.0 | -100 |
| -100.0 | -100 |
| -100.0 | -100 |
| -100.0 | -100 |
| -100.0 | -100 |
| -100.0 | -100 |
| -100.0 | -100 |
| -100.0 | -100 |
| -100.0 | -100 |
| -100.0 | -100 |
| 0.2577411959455074 | 0.117 |
| -100.0 | -100 |
| -100.0 | -100 |
| -100.0 | -100 |
| -100.0 | -100 |
| -100.0 | -100 |
| -100.0 | -100 |
| -100.0 | -100 |
| -100.0 | -100 |
| -100.0 | -100 |
| -100.0 | -100 |
| -100.0 | -100 |
| -100.0 | -100 |
| -100.0 | -100 |
| -100.0 | -100 |
| -100.0 | -100 |
| -100.0 | -100 |
| -100.0 | -100 |
| -100.0 | -100 |
| -100.0 | -100 |
| -100.0 | -100 |
| -100.0 | -100 |
| -100.0 | -100 |
| -100.0 | -100 |
| -100.0 | -100 |
| 0.3128516006483426 | 0.308 |
| -100.0 | -100 |
| -100.0 | -100 |
| -100.0 | -100 |
| -100.0 | -100 |
| -100.0 | -100 |
| -100.0 | -100 |
| -100.0 | -100 |
| -100.0 | -100 |
| -100.0 | -100 |
| -100.0 | -100 |
| -100.0 | -100 |
| -100.0 | -100 |
| -100.0 | -100 |
| 0.5066923761383526 | 0.309 |
| 0.526828761234891 | 0.082 |
| -100.0 | -100 |
| -100.0 | -100 |
| -100.0 | -100 |
| -100.0 | -100 |
| -100.0 | -100 |
| -100.0 | -100 |
| -100.0 | -100 |
| -100.0 | -100 |
| -100.0 | -100 |
| -100.0 | -100 |
| -100.0 | -100 |
| -100.0 | -100 |
| -100.0 | -100 |
| -100.0 | -100 |
| -100.0 | -100 |
| -100.0 | -100 |
| -100.0 | -100 |
| -100.0 | -100 |
| -100.0 | -100 |
| -100.0 | -100 |
| -100.0 | -100 |
| -100.0 | -100 |
| -100.0 | -100 |
| -100.0 | -100 |
| -100.0 | -100 |
| -100.0 | -100 |
| -100.0 | -100 |
| -100.0 | -100 |
| -100.0 | -100 |
| -100.0 | -100 |
| 0.08488567385324741 | 0.361 |
| -100.0 | -100 |
| -100.0 | -100 |
| -100.0 | -100 |
| -100.0 | -100 |
| -100.0 | -100 |
| -100.0 | -100 |
| 0.767078818994839 | 0.044 |
| -100.0 | -100 |
| -100.0 | -100 |
| -100.0 | -100 |
| -100.0 | -100 |
| -100.0 | -100 |
| -100.0 | -100 |
| -100.0 | -100 |
| -100.0 | -100 |
| -100.0 | -100 |
| -100.0 | -100 |
| -100.0 | -100 |
| -100.0 | -100 |
| -100.0 | -100 |
| -100.0 | -100 |
| -100.0 | -100 |
| -100.0 | -100 |
| -100.0 | -100 |
| -100.0 | -100 |
| -100.0 | -100 |
| 0.8167448044641746 | 0.264 |
| -100.0 | -100 |
| -100.0 | -100 |
| -100.0 | -100 |
| -100.0 | -100 |
| 0.5380078448776712 | 0.266 |
| -100.0 | -100 |
| -100.0 | -100 |
| -100.0 | -100 |
| -100.0 | -100 |
| -100.0 | -100 |
| -100.0 | -100 |
| -100.0 | -100 |
| -100.0 | -100 |
| -100.0 | -100 |
| -100.0 | -100 |
| -100.0 | -100 |
| -100.0 | -100 |
| -100.0 | -100 |
| -100.0 | -100 |
| 0.9960840495721743 | 0.065 |
| -100.0 | -100 |
| -100.0 | -100 |
| -100.0 | -100 |
| -100.0 | -100 |
| -100.0 | -100 |
| -100.0 | -100 |
| -100.0 | -100 |
| -100.0 | -100 |
| 0.13613572202749424 | 0.216 |
| -100.0 | -100 |
| -100.0 | -100 |
| -100.0 | -100 |
| -100.0 | -100 |
| -100.0 | -100 |
| -100.0 | -100 |
| -100.0 | -100 |
| 0.1372883604226175 | 0.054 |
| -100.0 | -100 |
| -100.0 | -100 |
| -100.0 | -100 |
| -100.0 | -100 |
| -100.0 | -100 |
| -100.0 | -100 |
| -100.0 | -100 |
| -100.0 | -100 |
| -100.0 | -100 |
| -100.0 | -100 |
| -100.0 | -100 |
| -100.0 | -100 |
| -100.0 | -100 |
| -100.0 | -100 |
| -100.0 | -100 |
| -100.0 | -100 |
| -100.0 | -100 |
| -100.0 | -100 |
| -100.0 | -100 |
| -100.0 | -100 |
| -100.0 | -100 |
| -100.0 | -100 |
| -100.0 | -100 |
| -100.0 | -100 |
| -100.0 | -100 |
| 0.14707317036206746 | 0.301 |
| -100.0 | -100 |
| -100.0 | -100 |
| -100.0 | -100 |
| -100.0 | -100 |
| -100.0 | -100 |
| -100.0 | -100 |
| 0.2923925554267407 | 0.205 |
| -100.0 | -100 |
| -100.0 | -100 |
| -100.0 | -100 |
| -100.0 | -100 |
| -100.0 | -100 |
| -100.0 | -100 |
| -100.0 | -100 |
| -100.0 | -100 |
| -100.0 | -100 |
| 0.5908468565777375 | 0.114 |
| -100.0 | -100 |
| 0.019241356535862675 | 0.201 |
| -100.0 | -100 |
| -100.0 | -100 |
| -100.0 | -100 |
| -100.0 | -100 |
| -100.0 | -100 |
| -100.0 | -100 |
| -100.0 | -100 |
| -100.0 | -100 |
| -100.0 | -100 |
| -100.0 | -100 |
| -100.0 | -100 |
| -100.0 | -100 |
| -100.0 | -100 |
| 0.757896251876324 | 0.124 |
| -100.0 | -100 |
| -100.0 | -100 |
| -100.0 | -100 |
| -100.0 | -100 |
| -100.0 | -100 |
| -100.0 | -100 |
| 0.4604706965337454 | 0.133 |
| -100.0 | -100 |
| -100.0 | -100 |
| -100.0 | -100 |
| -100.0 | -100 |
| 0.1335242780528605 | 0.065 |
| -100.0 | -100 |
| -100.0 | -100 |
| 0.7218077447882552 | 0.342 |
| -100.0 | -100 |
| -100.0 | -100 |
| 0.9626665869281891 | 0.43 |
| -100.0 | -100 |
| -100.0 | -100 |
| -100.0 | -100 |
| -100.0 | -100 |
| -100.0 | -100 |
| -100.0 | -100 |
| -100.0 | -100 |
| -100.0 | -100 |
| -100.0 | -100 |
| -100.0 | -100 |
| -100.0 | -100 |
| -100.0 | -100 |
| 0.6275464704265149 | 0.238 |
| -100.0 | -100 |
| 0.2851694001306042 | 0.071 |
| -100.0 | -100 |
| -100.0 | -100 |
| -100.0 | -100 |
| -100.0 | -100 |
| -100.0 | -100 |
| -100.0 | -100 |
| -100.0 | -100 |
| -100.0 | -100 |
| -100.0 | -100 |
| -100.0 | -100 |
| -100.0 | -100 |
| -100.0 | -100 |
| -100.0 | -100 |
| -100.0 | -100 |
| 0.14816456394776112 | 0.083 |
| -100.0 | -100 |
| -100.0 | -100 |
| -100.0 | -100 |
| -100.0 | -100 |
| -100.0 | -100 |
| 0.747636566123011 | 0.401 |
| -100.0 | -100 |
| -100.0 | -100 |
| -100.0 | -100 |
| -100.0 | -100 |
| -100.0 | -100 |
| -100.0 | -100 |
| -100.0 | -100 |
| -100.0 | -100 |
| -100.0 | -100 |
| -100.0 | -100 |
| -100.0 | -100 |
| -100.0 | -100 |
| -100.0 | -100 |
| -100.0 | -100 |
| -100.0 | -100 |
| -100.0 | -100 |
| 0.7743096508715519 | 0.306 |
| -100.0 | -100 |
| -100.0 | -100 |
| 0.7876188741355509 | 0.423 |
| -100.0 | -100 |
| -100.0 | -100 |
| -100.0 | -100 |
| -100.0 | -100 |
| -100.0 | -100 |
| -100.0 | -100 |
| -100.0 | -100 |
| -100.0 | -100 |
| -100.0 | -100 |
| -100.0 | -100 |
| -100.0 | -100 |
| -100.0 | -100 |
| -100.0 | -100 |
| -100.0 | -100 |
| -100.0 | -100 |
| -100.0 | -100 |
| -100.0 | -100 |
| -100.0 | -100 |
| -100.0 | -100 |
| -100.0 | -100 |
| -100.0 | -100 |
| -100.0 | -100 |
| -100.0 | -100 |
| -100.0 | -100 |
| -100.0 | -100 |
| -100.0 | -100 |
| -100.0 | -100 |
| -100.0 | -100 |
| -100.0 | -100 |
| -100.0 | -100 |
| -100.0 | -100 |
| -100.0 | -100 |
| -100.0 | -100 |
| -100.0 | -100 |
| -100.0 | -100 |
| -100.0 | -100 |
| 0.7596506397641933 | 0.377 |
| -100.0 | -100 |
| -100.0 | -100 |
| -100.0 | -100 |
| -100.0 | -100 |
| -100.0 | -100 |
| -100.0 | -100 |
| -100.0 | -100 |
| -100.0 | -100 |
| 0.03010532963649648 | 0.095 |
| -100.0 | -100 |
| 0.9166317126420692 | 0.279 |
| -100.0 | -100 |
| 0.6113063943683711 | 0.373 |
| -100.0 | -100 |
| -100.0 | -100 |
| -100.0 | -100 |
| -100.0 | -100 |
| -100.0 | -100 |
| -100.0 | -100 |
| -100.0 | -100 |
| -100.0 | -100 |
| -100.0 | -100 |
| -100.0 | -100 |
| 0.09187254431633807 | 0.055 |
| -100.0 | -100 |
| -100.0 | -100 |
| -100.0 | -100 |
| -100.0 | -100 |
| -100.0 | -100 |
| -100.0 | -100 |
| -100.0 | -100 |
| -100.0 | -100 |
| -100.0 | -100 |
| -100.0 | -100 |
| 0.48961745407735247 | 0.078 |
| -100.0 | -100 |
| -100.0 | -100 |
| -100.0 | -100 |
| -100.0 | -100 |
| -100.0 | -100 |
| -100.0 | -100 |
| -100.0 | -100 |
| -100.0 | -100 |
| -100.0 | -100 |
| -100.0 | -100 |
| -100.0 | -100 |
| -100.0 | -100 |
| -100.0 | -100 |
| -100.0 | -100 |
| -100.0 | -100 |
| -100.0 | -100 |
| -100.0 | -100 |
| -100.0 | -100 |
| -100.0 | -100 |
| -100.0 | -100 |
| -100.0 | -100 |
| -100.0 | -100 |
| -100.0 | -100 |
| -100.0 | -100 |
| -100.0 | -100 |
| -100.0 | -100 |
| -100.0 | -100 |
| -100.0 | -100 |
| -100.0 | -100 |
| -100.0 | -100 |
| -100.0 | -100 |
| -100.0 | -100 |
| -100.0 | -100 |
| -100.0 | -100 |
| -100.0 | -100 |
| -100.0 | -100 |
| 0.94926432990282 | 0.217 |
| -100.0 | -100 |
| -100.0 | -100 |
| -100.0 | -100 |
| -100.0 | -100 |
| -100.0 | -100 |
| -100.0 | -100 |
| -100.0 | -100 |
| -100.0 | -100 |
| -100.0 | -100 |
| -100.0 | -100 |
| -100.0 | -100 |
| -100.0 | -100 |
| -100.0 | -100 |
| -100.0 | -100 |
| -100.0 | -100 |
| -100.0 | -100 |
| -100.0 | -100 |
| -100.0 | -100 |
| -100.0 | -100 |
| -100.0 | -100 |
| -100.0 | -100 |
| -100.0 | -100 |
| -100.0 | -100 |
| -100.0 | -100 |
| -100.0 | -100 |
| -100.0 | -100 |
| -100.0 | -100 |
| -100.0 | -100 |
| 0.9496624990078197 | 0.315 |
| -100.0 | -100 |
| -100.0 | -100 |
| -100.0 | -100 |
| -100.0 | -100 |
| -100.0 | -100 |
| 0.722807435017604 | 0.236 |
| -100.0 | -100 |
| 0.3980815475530405 | 0.115 |
| -100.0 | -100 |
| -100.0 | -100 |
| -100.0 | -100 |
| -100.0 | -100 |
| 0.8215802901010572 | 0.238 |
| -100.0 | -100 |
| -100.0 | -100 |
| 0.47352973316695157 | 0.235 |
| -100.0 | -100 |
| -100.0 | -100 |
| -100.0 | -100 |
| -100.0 | -100 |
| -100.0 | -100 |
| -100.0 | -100 |
| -100.0 | -100 |
| -100.0 | -100 |
| 0.22568254085986228 | 0.399 |
| -100.0 | -100 |
| -100.0 | -100 |
| -100.0 | -100 |
| -100.0 | -100 |
| -100.0 | -100 |
| -100.0 | -100 |
| -100.0 | -100 |
| -100.0 | -100 |
| -100.0 | -100 |
| -100.0 | -100 |
| -100.0 | -100 |
| -100.0 | -100 |
| -100.0 | -100 |
| 0.7180873551647725 | 0.127 |
| -100.0 | -100 |
| -100.0 | -100 |
| -100.0 | -100 |
| -100.0 | -100 |
| -100.0 | -100 |
| -100.0 | -100 |
| -100.0 | -100 |
| -100.0 | -100 |
| 0.24771475455152814 | 0.14 |
| -100.0 | -100 |
| -100.0 | -100 |
| -100.0 | -100 |
| -100.0 | -100 |
| -100.0 | -100 |
| -100.0 | -100 |
| -100.0 | -100 |
| -100.0 | -100 |
| -100.0 | -100 |
| -100.0 | -100 |
| -100.0 | -100 |
| -100.0 | -100 |
| -100.0 | -100 |
| -100.0 | -100 |
| -100.0 | -100 |
| -100.0 | -100 |
| -100.0 | -100 |
| 0.7164771006986068 | 0.205 |
| -100.0 | -100 |
| -100.0 | -100 |
| -100.0 | -100 |
| -100.0 | -100 |
| -100.0 | -100 |
| -100.0 | -100 |
| -100.0 | -100 |
| -100.0 | -100 |
| -100.0 | -100 |
| -100.0 | -100 |
| -100.0 | -100 |
| -100.0 | -100 |
| -100.0 | -100 |
| -100.0 | -100 |
| -100.0 | -100 |
| -100.0 | -100 |
| -100.0 | -100 |
| 0.5652352943350611 | 0.288 |
| -100.0 | -100 |
| -100.0 | -100 |
| -100.0 | -100 |
| -100.0 | -100 |
| 0.5951476755664121 | 0.027 |
| -100.0 | -100 |
| -100.0 | -100 |
| -100.0 | -100 |
| -100.0 | -100 |
| -100.0 | -100 |
| -100.0 | -100 |
| -100.0 | -100 |
| -100.0 | -100 |
| -100.0 | -100 |
| -100.0 | -100 |
| -100.0 | -100 |
| -100.0 | -100 |
| -100.0 | -100 |
| -100.0 | -100 |
| -100.0 | -100 |
| -100.0 | -100 |
| -100.0 | -100 |
| -100.0 | -100 |
| -100.0 | -100 |
| -100.0 | -100 |
| -100.0 | -100 |
| -100.0 | -100 |
| -100.0 | -100 |
| 0.8842736723407711 | 0.296 |
| -100.0 | -100 |
| -100.0 | -100 |
| -100.0 | -100 |
| -100.0 | -100 |
| -100.0 | -100 |
| -100.0 | -100 |
| -100.0 | -100 |
| -100.0 | -100 |
| 0.8625496007586477 | 0.06 |
| -100.0 | -100 |
| -100.0 | -100 |
| -100.0 | -100 |
| 0.3003290786116253 | 0.385 |
| -100.0 | -100 |
| -100.0 | -100 |
| -100.0 | -100 |
| -100.0 | -100 |
| -100.0 | -100 |
| -100.0 | -100 |
| -100.0 | -100 |
| 0.3817000337111911 | 0.387 |
| -100.0 | -100 |
| -100.0 | -100 |
| -100.0 | -100 |
| -100.0 | -100 |
| -100.0 | -100 |
| -100.0 | -100 |
| -100.0 | -100 |
| -100.0 | -100 |
| -100.0 | -100 |
| -100.0 | -100 |
| -100.0 | -100 |
| 0.6751963874078637 | 0.187 |
| -100.0 | -100 |
| -100.0 | -100 |
| -100.0 | -100 |
| -100.0 | -100 |
| -100.0 | -100 |
| -100.0 | -100 |
| -100.0 | -100 |
| -100.0 | -100 |
| -100.0 | -100 |
| -100.0 | -100 |
| -100.0 | -100 |
| -100.0 | -100 |
| -100.0 | -100 |
| 0.6733270867407201 | 0.444 |
| -100.0 | -100 |
| -100.0 | -100 |
| -100.0 | -100 |
| -100.0 | -100 |
| -100.0 | -100 |
| 0.36789893217290215 | 0.295 |
| -100.0 | -100 |
| -100.0 | -100 |
| -100.0 | -100 |
| -100.0 | -100 |
| -100.0 | -100 |
| -100.0 | -100 |
| -100.0 | -100 |
| -100.0 | -100 |
| -100.0 | -100 |
| -100.0 | -100 |
| -100.0 | -100 |
| -100.0 | -100 |
| -100.0 | -100 |
| -100.0 | -100 |
| -100.0 | -100 |
| -100.0 | -100 |
| 0.6987957141194837 | 0.08 |
| -100.0 | -100 |
| -100.0 | -100 |
| -100.0 | -100 |
| -100.0 | -100 |
| -100.0 | -100 |
| -100.0 | -100 |
| -100.0 | -100 |
| -100.0 | -100 |
| -100.0 | -100 |
| -100.0 | -100 |
| -100.0 | -100 |
| 0.38661401066867707 | 0.034 |
| 0.350170319511906 | 0.302 |
| -100.0 | -100 |
| -100.0 | -100 |
| 0.766882398215803 | 0.281 |
| -100.0 | -100 |
| 0.21848884258866497 | 0.148 |
| -100.0 | -100 |
| -100.0 | -100 |
| -100.0 | -100 |
| -100.0 | -100 |
| -100.0 | -100 |
| 0.21554560493070818 | 0.233 |
| -100.0 | -100 |
| 0.6151032711005467 | 0.128 |
| -100.0 | -100 |
| -100.0 | -100 |
| -100.0 | -100 |
| -100.0 | -100 |
| -100.0 | -100 |
| -100.0 | -100 |
| -100.0 | -100 |
| 0.80329277532535 | 0.085 |
| -100.0 | -100 |
| -100.0 | -100 |
| -100.0 | -100 |
| -100.0 | -100 |
| -100.0 | -100 |
| -100.0 | -100 |
| -100.0 | -100 |
| -100.0 | -100 |
| -100.0 | -100 |
| -100.0 | -100 |
| -100.0 | -100 |
| -100.0 | -100 |
| -100.0 | -100 |
| -100.0 | -100 |
| -100.0 | -100 |
| -100.0 | -100 |
| -100.0 | -100 |
| -100.0 | -100 |
| -100.0 | -100 |
| 0.2297482021344428 | 0.149 |
| -100.0 | -100 |
| -100.0 | -100 |
| -100.0 | -100 |
| -100.0 | -100 |
| -100.0 | -100 |
| -100.0 | -100 |
| 0.09239146047317692 | 0.364 |
| -100.0 | -100 |
| -100.0 | -100 |
| 0.36699457462123597 | 0.001 |
| -100.0 | -100 |
| -100.0 | -100 |
| -100.0 | -100 |
| -100.0 | -100 |
| -100.0 | -100 |
| -100.0 | -100 |
| 0.1363051346816505 | 0.293 |
| -100.0 | -100 |
| -100.0 | -100 |
| -100.0 | -100 |
| -100.0 | -100 |
| -100.0 | -100 |
| -100.0 | -100 |
| -100.0 | -100 |
| -100.0 | -100 |
| -100.0 | -100 |
| -100.0 | -100 |
| -100.0 | -100 |
| -100.0 | -100 |
| -100.0 | -100 |
| -100.0 | -100 |
| -100.0 | -100 |
| -100.0 | -100 |
| -100.0 | -100 |
| -100.0 | -100 |
| -100.0 | -100 |
| -100.0 | -100 |
| -100.0 | -100 |
| -100.0 | -100 |
| -100.0 | -100 |
| -100.0 | -100 |
| -100.0 | -100 |
| -100.0 | -100 |
| -100.0 | -100 |
| -100.0 | -100 |
| 0.7723980594619854 | 0.109 |
| -100.0 | -100 |
| -100.0 | -100 |
| -100.0 | -100 |
| -100.0 | -100 |
| -100.0 | -100 |
| -100.0 | -100 |
| -100.0 | -100 |
| -100.0 | -100 |
| -100.0 | -100 |
| -100.0 | -100 |
| -100.0 | -100 |
| 0.863612543692298 | 0.077 |
| -100.0 | -100 |
| -100.0 | -100 |
| -100.0 | -100 |
| -100.0 | -100 |
| -100.0 | -100 |
| -100.0 | -100 |
| -100.0 | -100 |
| -100.0 | -100 |
| 0.8201892639834811 | 0.192 |
| -100.0 | -100 |
| -100.0 | -100 |
| -100.0 | -100 |
| -100.0 | -100 |
| -100.0 | -100 |
| -100.0 | -100 |
| -100.0 | -100 |
| -100.0 | -100 |
| -100.0 | -100 |
| 0.5215893286767999 | 0.278 |
| -100.0 | -100 |
| -100.0 | -100 |
| -100.0 | -100 |
| 0.6126124953118174 | 0.156 |
| -100.0 | -100 |
| -100.0 | -100 |
| -100.0 | -100 |
| -100.0 | -100 |
| -100.0 | -100 |
| -100.0 | -100 |
| -100.0 | -100 |
| -100.0 | -100 |
| -100.0 | -100 |
| -100.0 | -100 |
| -100.0 | -100 |
| -100.0 | -100 |
| -100.0 | -100 |
| -100.0 | -100 |
| -100.0 | -100 |
| 0.03411159099787675 | 0.105 |
| -100.0 | -100 |
| -100.0 | -100 |
| -100.0 | -100 |
| -100.0 | -100 |
| -100.0 | -100 |
| -100.0 | -100 |
| -100.0 | -100 |
| -100.0 | -100 |
| -100.0 | -100 |
| -100.0 | -100 |
| -100.0 | -100 |
| -100.0 | -100 |
| 0.9005197676697985 | 0.1 |
| -100.0 | -100 |
| -100.0 | -100 |
| -100.0 | -100 |
| -100.0 | -100 |
| 0.20739651286316851 | 0.141 |
| -100.0 | -100 |
| -100.0 | -100 |
| -100.0 | -100 |
| -100.0 | -100 |
| -100.0 | -100 |
| -100.0 | -100 |
| -100.0 | -100 |
| -100.0 | -100 |
| -100.0 | -100 |
| -100.0 | -100 |
| -100.0 | -100 |
| -100.0 | -100 |
| -100.0 | -100 |
| -100.0 | -100 |
| -100.0 | -100 |
| -100.0 | -100 |
| -100.0 | -100 |
| -100.0 | -100 |
| 0.46452716556004137 | 0.091 |
| -100.0 | -100 |
| -100.0 | -100 |
| -100.0 | -100 |
| -100.0 | -100 |
| -100.0 | -100 |
| -100.0 | -100 |
| -100.0 | -100 |
| -100.0 | -100 |
| 0.4152092108803441 | 0.052 |
| -100.0 | -100 |
| -100.0 | -100 |
| -100.0 | -100 |
| -100.0 | -100 |
| -100.0 | -100 |
| -100.0 | -100 |
| -100.0 | -100 |
| -100.0 | -100 |
| -100.0 | -100 |
| -100.0 | -100 |
| -100.0 | -100 |
| 0.9609099871828233 | 0.242 |
| -100.0 | -100 |
| -100.0 | -100 |
| -100.0 | -100 |
| -100.0 | -100 |
| -100.0 | -100 |
| 0.7917086025236442 | 0.338 |
| -100.0 | -100 |
| -100.0 | -100 |
| -100.0 | -100 |
| -100.0 | -100 |
| -100.0 | -100 |
| -100.0 | -100 |
| 0.9440285373143977 | 0.142 |
| -100.0 | -100 |
| -100.0 | -100 |
| -100.0 | -100 |
| 0.6040678676740812 | 0.218 |
| 0.6119096102472928 | 0.027 |
| 0.8999029728803304 | 0.067 |
| -100.0 | -100 |
| -100.0 | -100 |
| -100.0 | -100 |
| 0.5342381026270087 | 0.422 |
| -100.0 | -100 |
| 0.942051972643263 | 0.068 |
| -100.0 | -100 |
| -100.0 | -100 |
| -100.0 | -100 |
| -100.0 | -100 |
| 0.8789280960588822 | 0.088 |
| -100.0 | -100 |
| 0.71339112871652 | 0.062 |
| -100.0 | -100 |
| -100.0 | -100 |
| -100.0 | -100 |
| -100.0 | -100 |
| -100.0 | -100 |
| -100.0 | -100 |
| -100.0 | -100 |
| -100.0 | -100 |
| -100.0 | -100 |
| -100.0 | -100 |
| -100.0 | -100 |
| -100.0 | -100 |
| -100.0 | -100 |
| 0.5256001089483502 | 0.428 |
| -100.0 | -100 |
| -100.0 | -100 |
| -100.0 | -100 |
| 0.20090344715394493 | 0.362 |
| -100.0 | -100 |
| -100.0 | -100 |
| -100.0 | -100 |
| -100.0 | -100 |
| -100.0 | -100 |
| -100.0 | -100 |
| -100.0 | -100 |
| -100.0 | -100 |
| -100.0 | -100 |
| -100.0 | -100 |
| -100.0 | -100 |
| -100.0 | -100 |
| -100.0 | -100 |
| -100.0 | -100 |
| -100.0 | -100 |
| -100.0 | -100 |
| 0.10885515151981962 | 0.279 |
| -100.0 | -100 |
| -100.0 | -100 |
| -100.0 | -100 |
| -100.0 | -100 |
| -100.0 | -100 |
| -100.0 | -100 |
| -100.0 | -100 |
| -100.0 | -100 |
| 0.8284537800590076 | 0.069 |
| -100.0 | -100 |
| -100.0 | -100 |
| -100.0 | -100 |
| 0.41842897433166715 | 0.22 |
| -100.0 | -100 |
| -100.0 | -100 |
| 0.9723403061356286 | 0.165 |
| -100.0 | -100 |
| -100.0 | -100 |
| -100.0 | -100 |
| -100.0 | -100 |
| -100.0 | -100 |
| -100.0 | -100 |
| -100.0 | -100 |
| -100.0 | -100 |
| 0.4079293640185233 | 0.311 |
| -100.0 | -100 |
| -100.0 | -100 |
| -100.0 | -100 |
| -100.0 | -100 |
| -100.0 | -100 |
| 0.5188619525086438 | 0.218 |
| -100.0 | -100 |
| -100.0 | -100 |
| -100.0 | -100 |
| -100.0 | -100 |
| -100.0 | -100 |
| -100.0 | -100 |
| -100.0 | -100 |
| 0.640862422291765 | 0.142 |
| -100.0 | -100 |
| -100.0 | -100 |
| -100.0 | -100 |
| -100.0 | -100 |
| -100.0 | -100 |
| 0.0097903757041784 | 0.173 |
| -100.0 | -100 |
| -100.0 | -100 |
| 0.6866722832706231 | 0.077 |
| -100.0 | -100 |
| 0.4559818349982744 | 0.179 |
| -100.0 | -100 |
| 0.39892591455288107 | 0.096 |
| 0.3951794550660904 | 0.34 |
| -100.0 | -100 |
| -100.0 | -100 |
| -100.0 | -100 |
| -100.0 | -100 |
| -100.0 | -100 |
| -100.0 | -100 |
| 0.34885279980474304 | 0.057 |
| -100.0 | -100 |
| -100.0 | -100 |
| -100.0 | -100 |
| -100.0 | -100 |
| -100.0 | -100 |
| -100.0 | -100 |
| -100.0 | -100 |
| -100.0 | -100 |
| -100.0 | -100 |
| 0.47304292741978815 | 0.254 |
| -100.0 | -100 |
| -100.0 | -100 |
| -100.0 | -100 |
| -100.0 | -100 |
| -100.0 | -100 |
| -100.0 | -100 |
| -100.0 | -100 |
| -100.0 | -100 |
| -100.0 | -100 |
| -100.0 | -100 |
| -100.0 | -100 |
| -100.0 | -100 |
| -100.0 | -100 |
| -100.0 | -100 |
| -100.0 | -100 |
| -100.0 | -100 |
| -100.0 | -100 |
| -100.0 | -100 |
| -100.0 | -100 |
| -100.0 | -100 |
| -100.0 | -100 |
| -100.0 | -100 |
| -100.0 | -100 |
| -100.0 | -100 |
| -100.0 | -100 |
| -100.0 | -100 |
| -100.0 | -100 |
| -100.0 | -100 |
| -100.0 | -100 |
| -100.0 | -100 |
| 0.40049464914224153 | 0.214 |
| -100.0 | -100 |
| 0.5194678613721865 | 0.112 |
| -100.0 | -100 |
| -100.0 | -100 |
| -100.0 | -100 |
| -100.0 | -100 |
| 0.9995448950273633 | 0.434 |
| -100.0 | -100 |
| -100.0 | -100 |
| -100.0 | -100 |
| -100.0 | -100 |
| -100.0 | -100 |
| -100.0 | -100 |
| -100.0 | -100 |
| -100.0 | -100 |
| -100.0 | -100 |
| 0.054692877461311795 | 0.185 |
| -100.0 | -100 |
| -100.0 | -100 |
| -100.0 | -100 |
| -100.0 | -100 |
| -100.0 | -100 |
| -100.0 | -100 |
| 0.08275564810261782 | 0.39 |
| -100.0 | -100 |
| -100.0 | -100 |
| -100.0 | -100 |
| -100.0 | -100 |
| -100.0 | -100 |
| 0.03689739210115128 | 0.075 |
| -100.0 | -100 |
| -100.0 | -100 |
| -100.0 | -100 |
| -100.0 | -100 |
| -100.0 | -100 |
| -100.0 | -100 |
| -100.0 | -100 |
| -100.0 | -100 |
| -100.0 | -100 |
| -100.0 | -100 |
| -100.0 | -100 |
| -100.0 | -100 |
| -100.0 | -100 |
| -100.0 | -100 |
| -100.0 | -100 |
| -100.0 | -100 |
| -100.0 | -100 |
| -100.0 | -100 |
| -100.0 | -100 |
| -100.0 | -100 |
| -100.0 | -100 |
| -100.0 | -100 |
| -100.0 | -100 |
| -100.0 | -100 |
| -100.0 | -100 |
| -100.0 | -100 |
| -100.0 | -100 |
| -100.0 | -100 |
| -100.0 | -100 |
| -100.0 | -100 |
| -100.0 | -100 |
| -100.0 | -100 |
| -100.0 | -100 |
| -100.0 | -100 |
| -100.0 | -100 |
| -100.0 | -100 |
| 0.8653500522019243 | 0.119 |
| -100.0 | -100 |
| -100.0 | -100 |
| -100.0 | -100 |
| -100.0 | -100 |
| 0.6337023767918983 | 0.288 |
| -100.0 | -100 |
| -100.0 | -100 |
| -100.0 | -100 |
| -100.0 | -100 |
| -100.0 | -100 |
| -100.0 | -100 |
| -100.0 | -100 |
| -100.0 | -100 |
| -100.0 | -100 |
| -100.0 | -100 |
| -100.0 | -100 |
| -100.0 | -100 |
| -100.0 | -100 |
| -100.0 | -100 |
| -100.0 | -100 |
| -100.0 | -100 |
| -100.0 | -100 |
| -100.0 | -100 |
| -100.0 | -100 |
| -100.0 | -100 |
| -100.0 | -100 |
| -100.0 | -100 |
| 0.6539248599569031 | 0.079 |
| -100.0 | -100 |
| 0.6897856873676093 | 0.281 |
| -100.0 | -100 |
| -100.0 | -100 |
| -100.0 | -100 |
| -100.0 | -100 |
| -100.0 | -100 |
| -100.0 | -100 |
| -100.0 | -100 |
| -100.0 | -100 |
| -100.0 | -100 |
| -100.0 | -100 |
| -100.0 | -100 |
| -100.0 | -100 |
| -100.0 | -100 |
| -100.0 | -100 |
| -100.0 | -100 |
| -100.0 | -100 |
| -100.0 | -100 |
| 0.0018477389728823734 | 0.076 |
| 0.37035111830458434 | 0.165 |
| -100.0 | -100 |
| -100.0 | -100 |
| 0.4732035830809479 | 0.124 |
| -100.0 | -100 |
| -100.0 | -100 |
| -100.0 | -100 |
| -100.0 | -100 |
| -100.0 | -100 |
| -100.0 | -100 |
| -100.0 | -100 |
| -100.0 | -100 |
| -100.0 | -100 |
| -100.0 | -100 |
| -100.0 | -100 |
| -100.0 | -100 |
| -100.0 | -100 |
| -100.0 | -100 |
| -100.0 | -100 |
| -100.0 | -100 |
| -100.0 | -100 |
| -100.0 | -100 |
| -100.0 | -100 |
| 0.5928877375799231 | 0.244 |
| -100.0 | -100 |
| -100.0 | -100 |
| -100.0 | -100 |
| -100.0 | -100 |
| -100.0 | -100 |
| -100.0 | -100 |
| -100.0 | -100 |
| -100.0 | -100 |
| -100.0 | -100 |
| -100.0 | -100 |
| -100.0 | -100 |
| -100.0 | -100 |
| 0.0833856747101881 | 0.036 |
| -100.0 | -100 |
| 0.9106853582706057 | 0.286 |
| -100.0 | -100 |
| -100.0 | -100 |
| -100.0 | -100 |
| 0.6324613678089969 | 0.357 |
| -100.0 | -100 |
| -100.0 | -100 |
| -100.0 | -100 |
| -100.0 | -100 |
| -100.0 | -100 |
| -100.0 | -100 |
| -100.0 | -100 |
| -100.0 | -100 |
| -100.0 | -100 |
| -100.0 | -100 |
| -100.0 | -100 |
| -100.0 | -100 |
| -100.0 | -100 |
| -100.0 | -100 |
| -100.0 | -100 |
| -100.0 | -100 |
| -100.0 | -100 |
| -100.0 | -100 |
| -100.0 | -100 |
| -100.0 | -100 |
| -100.0 | -100 |
| -100.0 | -100 |
| -100.0 | -100 |
| -100.0 | -100 |
| -100.0 | -100 |
| -100.0 | -100 |
| -100.0 | -100 |
| -100.0 | -100 |
| -100.0 | -100 |
| -100.0 | -100 |
| -100.0 | -100 |
| -100.0 | -100 |
| -100.0 | -100 |
| -100.0 | -100 |
| -100.0 | -100 |
| -100.0 | -100 |
| -100.0 | -100 |
| -100.0 | -100 |
| -100.0 | -100 |
| 0.5383783868807502 | 0.352 |
| -100.0 | -100 |
| -100.0 | -100 |
| 0.3643131698327017 | 0.032 |
| -100.0 | -100 |
| -100.0 | -100 |
| -100.0 | -100 |
| -100.0 | -100 |
| -100.0 | -100 |
| -100.0 | -100 |
| -100.0 | -100 |
| -100.0 | -100 |
| -100.0 | -100 |
| -100.0 | -100 |
| -100.0 | -100 |
| -100.0 | -100 |
| -100.0 | -100 |
| -100.0 | -100 |
| -100.0 | -100 |
| -100.0 | -100 |
| -100.0 | -100 |
| -100.0 | -100 |
| -100.0 | -100 |
| -100.0 | -100 |
| -100.0 | -100 |
| -100.0 | -100 |
| 0.2899981525536498 | 0.175 |
| -100.0 | -100 |
| -100.0 | -100 |
| -100.0 | -100 |
| -100.0 | -100 |
| -100.0 | -100 |
| -100.0 | -100 |
| -100.0 | -100 |
| -100.0 | -100 |
| -100.0 | -100 |
| -100.0 | -100 |
| -100.0 | -100 |
| -100.0 | -100 |
| -100.0 | -100 |
| -100.0 | -100 |
| -100.0 | -100 |
| 0.3829149215779577 | 0.152 |
| -100.0 | -100 |
| -100.0 | -100 |
| -100.0 | -100 |
| -100.0 | -100 |
| -100.0 | -100 |
| -100.0 | -100 |
| -100.0 | -100 |
| 0.2050089186632006 | 0.035 |
| -100.0 | -100 |
| -100.0 | -100 |
| -100.0 | -100 |
| -100.0 | -100 |
| -100.0 | -100 |
| -100.0 | -100 |
| -100.0 | -100 |
| -100.0 | -100 |
| -100.0 | -100 |
| -100.0 | -100 |
| 0.3015717627095069 | 0.269 |
| -100.0 | -100 |
| -100.0 | -100 |
| -100.0 | -100 |
| -100.0 | -100 |
| -100.0 | -100 |
| -100.0 | -100 |
| -100.0 | -100 |
| 0.10887583430796643 | 0.329 |
| -100.0 | -100 |
| -100.0 | -100 |
| -100.0 | -100 |
| 0.9973922562835004 | 0.315 |
| -100.0 | -100 |
| -100.0 | -100 |
| -100.0 | -100 |
| -100.0 | -100 |
| -100.0 | -100 |
| -100.0 | -100 |
| -100.0 | -100 |
| -100.0 | -100 |
| -100.0 | -100 |
| -100.0 | -100 |
| -100.0 | -100 |
| -100.0 | -100 |
| -100.0 | -100 |
| 0.04149563951233459 | 0.17 |
| -100.0 | -100 |
| -100.0 | -100 |
| -100.0 | -100 |
| -100.0 | -100 |
| -100.0 | -100 |
| -100.0 | -100 |
| -100.0 | -100 |
| -100.0 | -100 |
| -100.0 | -100 |
| -100.0 | -100 |
| -100.0 | -100 |
| -100.0 | -100 |
| -100.0 | -100 |
| -100.0 | -100 |
| -100.0 | -100 |
| -100.0 | -100 |
| -100.0 | -100 |
| -100.0 | -100 |
| -100.0 | -100 |
| -100.0 | -100 |
| -100.0 | -100 |
| -100.0 | -100 |
| -100.0 | -100 |
| -100.0 | -100 |
| -100.0 | -100 |
| -100.0 | -100 |
| -100.0 | -100 |
| -100.0 | -100 |
| -100.0 | -100 |
| -100.0 | -100 |
| -100.0 | -100 |
| -100.0 | -100 |
| -100.0 | -100 |
| -100.0 | -100 |
| -100.0 | -100 |
| -100.0 | -100 |
| -100.0 | -100 |
| -100.0 | -100 |
| -100.0 | -100 |
| -100.0 | -100 |
| -100.0 | -100 |
| -100.0 | -100 |
| -100.0 | -100 |
| -100.0 | -100 |
| -100.0 | -100 |
| -100.0 | -100 |
| -100.0 | -100 |
| -100.0 | -100 |
| -100.0 | -100 |
| -100.0 | -100 |
| -100.0 | -100 |
| -100.0 | -100 |
| -100.0 | -100 |
| -100.0 | -100 |
| -100.0 | -100 |
| -100.0 | -100 |
| 0.6942270176834222 | 0.307 |
| -100.0 | -100 |
| -100.0 | -100 |
| -100.0 | -100 |
| -100.0 | -100 |
| -100.0 | -100 |
| -100.0 | -100 |
| -100.0 | -100 |
| -100.0 | -100 |
| -100.0 | -100 |
| -100.0 | -100 |
| -100.0 | -100 |
| -100.0 | -100 |
| -100.0 | -100 |
| -100.0 | -100 |
| -100.0 | -100 |
| -100.0 | -100 |
| -100.0 | -100 |
| -100.0 | -100 |
| -100.0 | -100 |
| -100.0 | -100 |
| -100.0 | -100 |
| 0.9562314383063828 | 0.215 |
| 0.8451047027264285 | 0.094 |
| 0.8594474800400532 | 0.325 |
| -100.0 | -100 |
| -100.0 | -100 |
| -100.0 | -100 |
| -100.0 | -100 |
| -100.0 | -100 |
| -100.0 | -100 |
| -100.0 | -100 |
| -100.0 | -100 |
| -100.0 | -100 |
| -100.0 | -100 |
| -100.0 | -100 |
| 0.20220837292751215 | 0.209 |
| -100.0 | -100 |
| -100.0 | -100 |
| -100.0 | -100 |
| -100.0 | -100 |
| 0.9466577713654467 | 0.263 |
| -100.0 | -100 |
| -100.0 | -100 |
| -100.0 | -100 |
| 0.6828262526853045 | 0.073 |
| -100.0 | -100 |
| -100.0 | -100 |
| -100.0 | -100 |
| -100.0 | -100 |
| -100.0 | -100 |
| -100.0 | -100 |
| -100.0 | -100 |
| -100.0 | -100 |
| -100.0 | -100 |
| -100.0 | -100 |
| -100.0 | -100 |
| -100.0 | -100 |
| 0.6404015374595745 | 0.219 |
| -100.0 | -100 |
| -100.0 | -100 |
| -100.0 | -100 |
| 0.7682030996052522 | 0.064 |
| -100.0 | -100 |
| -100.0 | -100 |
| 0.7952852921833871 | 0.223 |
| -100.0 | -100 |
| -100.0 | -100 |
| -100.0 | -100 |
| -100.0 | -100 |
| -100.0 | -100 |
| 0.2593847331834994 | 0.273 |
| -100.0 | -100 |
| -100.0 | -100 |
| -100.0 | -100 |
| -100.0 | -100 |
| -100.0 | -100 |
| -100.0 | -100 |
| -100.0 | -100 |
| -100.0 | -100 |
| -100.0 | -100 |
| -100.0 | -100 |
| -100.0 | -100 |
| -100.0 | -100 |
| -100.0 | -100 |
| -100.0 | -100 |
| -100.0 | -100 |
| -100.0 | -100 |
| 0.8725937677880632 | 0.004 |
| -100.0 | -100 |
| 0.4903829915420501 | 0.146 |
| -100.0 | -100 |
| -100.0 | -100 |
| -100.0 | -100 |
| 0.19471522490123205 | 0.289 |
| -100.0 | -100 |
| 0.44803040452697185 | 0.096 |
| -100.0 | -100 |
| -100.0 | -100 |
| -100.0 | -100 |
| -100.0 | -100 |
| -100.0 | -100 |
| -100.0 | -100 |
| -100.0 | -100 |
| 0.28620746482827153 | 0.233 |
| -100.0 | -100 |
| -100.0 | -100 |
| -100.0 | -100 |
| -100.0 | -100 |
| -100.0 | -100 |
| 0.6835672163262456 | 0.035 |
| -100.0 | -100 |
| -100.0 | -100 |
| -100.0 | -100 |
| -100.0 | -100 |
| -100.0 | -100 |
| -100.0 | -100 |
| -100.0 | -100 |
| -100.0 | -100 |
| -100.0 | -100 |
| -100.0 | -100 |
| -100.0 | -100 |
| -100.0 | -100 |
| -100.0 | -100 |
| -100.0 | -100 |
| -100.0 | -100 |
| -100.0 | -100 |
| -100.0 | -100 |
| -100.0 | -100 |
| -100.0 | -100 |
| -100.0 | -100 |
| -100.0 | -100 |
| -100.0 | -100 |
| 0.44836087301529204 | 0.089 |
| -100.0 | -100 |
| 0.9374692147369313 | 0.091 |
| -100.0 | -100 |
| -100.0 | -100 |
| -100.0 | -100 |
| -100.0 | -100 |
| -100.0 | -100 |
| 0.9597535582220296 | 0.281 |
| -100.0 | -100 |
| -100.0 | -100 |
| -100.0 | -100 |
| -100.0 | -100 |
| -100.0 | -100 |
| -100.0 | -100 |
| -100.0 | -100 |
| -100.0 | -100 |
| -100.0 | -100 |
| -100.0 | -100 |
| 0.8695202873238463 | 0.227 |
| 0.004164000054521 | 0.289 |
| -100.0 | -100 |
| -100.0 | -100 |
| -100.0 | -100 |
| -100.0 | -100 |
| -100.0 | -100 |
| -100.0 | -100 |
| -100.0 | -100 |
| -100.0 | -100 |
| -100.0 | -100 |
| -100.0 | -100 |
| -100.0 | -100 |
| -100.0 | -100 |
| -100.0 | -100 |
| -100.0 | -100 |
| -100.0 | -100 |
| -100.0 | -100 |
| -100.0 | -100 |
| -100.0 | -100 |
| 0.7304184093519271 | 0.181 |
| -100.0 | -100 |
| -100.0 | -100 |
| -100.0 | -100 |
| -100.0 | -100 |
| -100.0 | -100 |
| -100.0 | -100 |
| -100.0 | -100 |
| -100.0 | -100 |
| 0.21243648519804414 | 0.16 |
| -100.0 | -100 |
| -100.0 | -100 |
| -100.0 | -100 |
| -100.0 | -100 |
| -100.0 | -100 |
| -100.0 | -100 |
| -100.0 | -100 |
| -100.0 | -100 |
| -100.0 | -100 |
| -100.0 | -100 |
| -100.0 | -100 |
| 0.6954012514544871 | 0.012 |
| -100.0 | -100 |
| -100.0 | -100 |
| -100.0 | -100 |
| -100.0 | -100 |
| -100.0 | -100 |
| -100.0 | -100 |
| -100.0 | -100 |
| -100.0 | -100 |
| 0.9600069438301011 | 0.229 |
| -100.0 | -100 |
| -100.0 | -100 |
| 0.6702019304135532 | 0.306 |
| -100.0 | -100 |
| -100.0 | -100 |
| -100.0 | -100 |
| -100.0 | -100 |
| -100.0 | -100 |
| -100.0 | -100 |
| -100.0 | -100 |
| -100.0 | -100 |
| -100.0 | -100 |
| -100.0 | -100 |
| -100.0 | -100 |
| -100.0 | -100 |
| -100.0 | -100 |
| -100.0 | -100 |
| -100.0 | -100 |
| -100.0 | -100 |
| -100.0 | -100 |
| -100.0 | -100 |
| -100.0 | -100 |
| -100.0 | -100 |
| -100.0 | -100 |
| -100.0 | -100 |
| -100.0 | -100 |
| -100.0 | -100 |